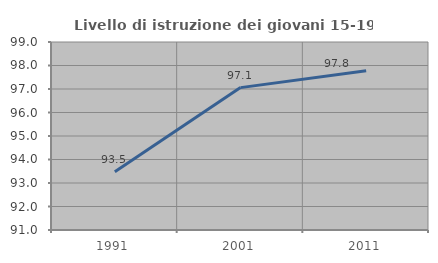
| Category | Livello di istruzione dei giovani 15-19 anni |
|---|---|
| 1991.0 | 93.478 |
| 2001.0 | 97.059 |
| 2011.0 | 97.778 |